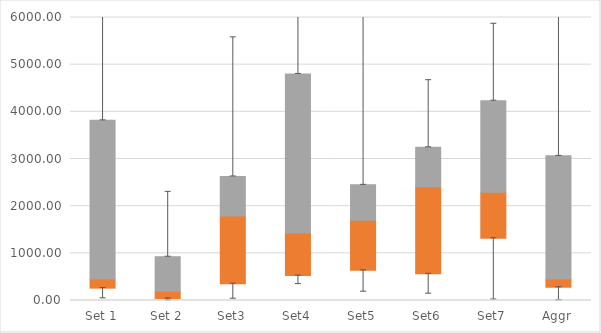
| Category | Q1 | Median-Q1 | Q3-Median |
|---|---|---|---|
| Set 1 | 262.42 | 191.104 | 3366.661 |
| Set 2 | 42.812 | 155.188 | 730.897 |
| Set3 | 356.171 | 1433.594 | 841.4 |
| Set4 | 528.19 | 901.787 | 3373.967 |
| Set5 | 638.805 | 1061.804 | 751.842 |
| Set6 | 564.731 | 1846.662 | 836.6 |
| Set7 | 1318.695 | 974.835 | 1943.243 |
| Aggr | 280.866 | 172.657 | 2613.06 |